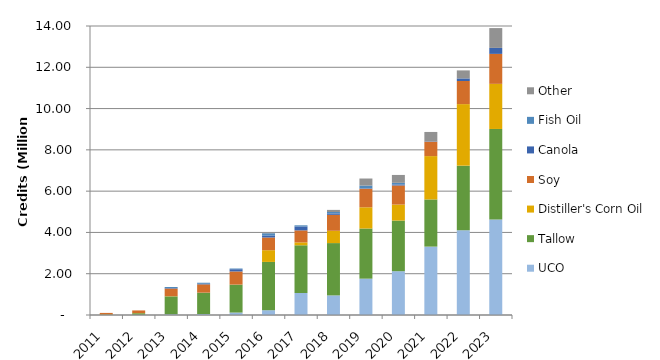
| Category | UCO | Tallow | Distiller's Corn Oil | Soy | Canola | Fish Oil | Other |
|---|---|---|---|---|---|---|---|
| 2011.0 | 0.001 | 0.019 | 0.008 | 0.073 | 0 | 0 | 0 |
| 2012.0 | 0.013 | 0.073 | 0.008 | 0.127 | 0.001 | 0 | 0 |
| 2013.0 | 0.034 | 0.868 | 0.008 | 0.373 | 0.023 | 0.051 | 0 |
| 2014.0 | 0.045 | 1.037 | 0.001 | 0.402 | 0.027 | 0.052 | 0 |
| 2015.0 | 0.119 | 1.351 | 0.004 | 0.637 | 0.107 | 0.035 | 0 |
| 2016.0 | 0.231 | 2.34 | 0.567 | 0.616 | 0.097 | 0.107 | 0.019 |
| 2017.0 | 1.065 | 2.312 | 0.14 | 0.583 | 0.189 | 0.055 | 0.002 |
| 2018.0 | 0.949 | 2.534 | 0.595 | 0.773 | 0.071 | 0.068 | 0.101 |
| 2019.0 | 1.76 | 2.429 | 1.028 | 0.899 | 0.021 | 0.134 | 0.34 |
| 2020.0 | 2.122 | 2.453 | 0.775 | 0.926 | 0.049 | 0.076 | 0.383 |
| 2021.0 | 3.312 | 2.285 | 2.1 | 0.699 | 0.018 | 0 | 0.453 |
| 2022.0 | 4.101 | 3.133 | 2.982 | 1.12 | 0.126 | 0 | 0.387 |
| 2023.0 | 4.63 | 4.382 | 2.185 | 1.452 | 0.29 | 0 | 0.96 |